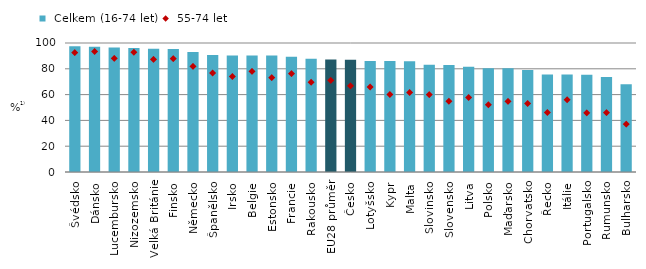
| Category |  Celkem (16-74 let) |
|---|---|
| Švédsko | 97.552 |
| Dánsko | 97.063 |
| Lucembursko | 96.42 |
| Nizozemsko | 96.048 |
| Velká Británie | 95.573 |
| Finsko | 95.291 |
| Německo | 92.979 |
| Španělsko | 90.719 |
| Irsko | 90.344 |
| Belgie | 90.275 |
| Estonsko | 90.233 |
| Francie | 89.386 |
| Rakousko | 87.752 |
| EU28 průměr | 87.151 |
| Česko | 87.034 |
| Lotyšsko | 86.135 |
| Kypr | 86.064 |
| Malta | 85.777 |
| Slovinsko | 83.108 |
| Slovensko | 82.854 |
| Litva | 81.582 |
| Polsko | 80.436 |
| Maďarsko | 80.372 |
| Chorvatsko | 79.08 |
| Řecko | 75.671 |
| Itálie | 75.568 |
| Portugalsko | 75.346 |
| Rumunsko | 73.657 |
| Bulharsko | 67.947 |